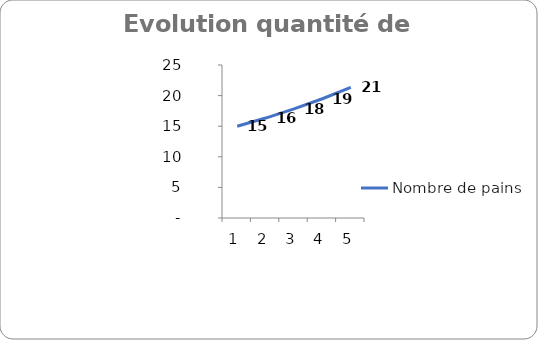
| Category | Nombre de pains |
|---|---|
| 0 | 15 |
| 1 | 16.33 |
| 2 | 17.818 |
| 3 | 19.485 |
| 4 | 21.354 |